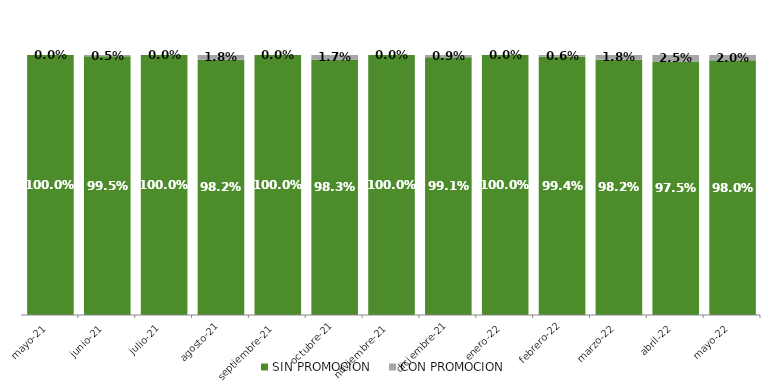
| Category | SIN PROMOCION   | CON PROMOCION   |
|---|---|---|
| 2021-05-01 | 1 | 0 |
| 2021-06-01 | 0.995 | 0.005 |
| 2021-07-01 | 1 | 0 |
| 2021-08-01 | 0.982 | 0.018 |
| 2021-09-01 | 1 | 0 |
| 2021-10-01 | 0.983 | 0.017 |
| 2021-11-01 | 1 | 0 |
| 2021-12-01 | 0.991 | 0.009 |
| 2022-01-01 | 1 | 0 |
| 2022-02-01 | 0.994 | 0.006 |
| 2022-03-01 | 0.982 | 0.018 |
| 2022-04-01 | 0.975 | 0.025 |
| 2022-05-01 | 0.98 | 0.02 |